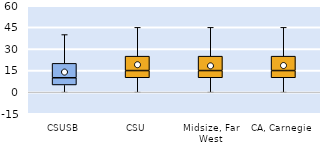
| Category | 25th | 50th | 75th |
|---|---|---|---|
| CSUSB | 5 | 5 | 10 |
| CSU | 10 | 5 | 10 |
| Midsize, Far West | 10 | 5 | 10 |
| CA, Carnegie | 10 | 5 | 10 |